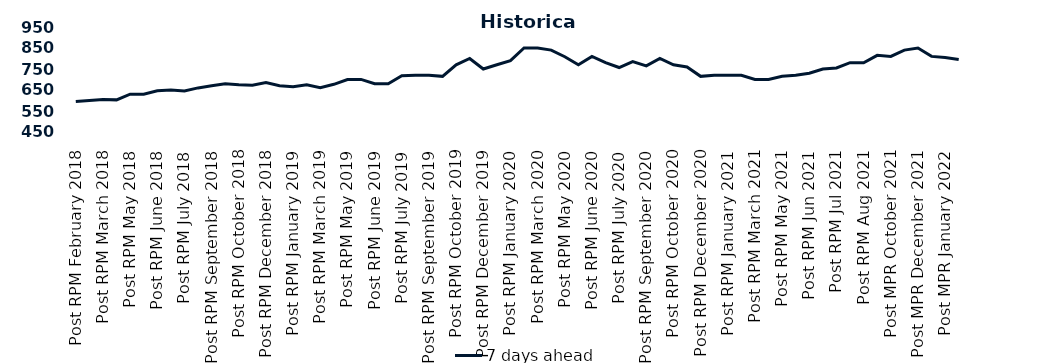
| Category | 7 days ahead |
|---|---|
| Post RPM February 2018 | 595 |
| Pre RPM March 2018 | 600 |
| Post RPM March 2018 | 605 |
| Pre RPM May 2018 | 603 |
| Post RPM May 2018 | 630 |
| Pre RPM June 2018 | 630 |
| Post RPM June 2018 | 646.5 |
| Pre RPM July 2018 | 650 |
| Post RPM July 2018 | 645 |
| Pre RPM September 2018 | 660 |
| Post RPM September 2018 | 670 |
| Pre RPM October 2018 | 680 |
| Post RPM October 2018 | 675 |
| Pre RPM December 2018 | 672.5 |
| Post RPM December 2018 | 685 |
| Pre RPM January 2019 | 670 |
| Post RPM January 2019 | 665 |
| Pre RPM March 2019 | 675 |
| Post RPM March 2019 | 661 |
| Pre RPM May 2019 | 677 |
| Post RPM May 2019 | 700 |
| Pre RPM June 2019 | 700.5 |
| Post RPM June 2019 | 680 |
| Pre RPM July 2019 | 680 |
| Post RPM July 2019 | 717.5 |
| Pre RPM September 2019 | 720 |
| Post RPM September 2019 | 720 |
| Pre RPM October 2019 | 715 |
| Post RPM October 2019 | 770 |
| Pre RPM December 2019 | 800 |
| Post RPM December 2019 | 750 |
| Pre RPM January 2020 | 770 |
| Post RPM January 2020 | 790 |
| Pre RPM March 2020 | 850 |
| Post RPM March 2020 | 850 |
| Pre RPM May 2020 | 840 |
| Post RPM May 2020 | 808.5 |
| Pre RPM June 2020 | 770 |
| Post RPM June 2020 | 810 |
| Pre RPM July 2020 | 780 |
| Post RPM July 2020 | 757 |
| Pre RPM September 2020 | 785 |
| Post RPM September 2020 | 765 |
| Pre RPM October 2020 | 800 |
| Post RPM October 2020 | 770 |
| Pre RPM December 2020 | 760 |
|  Post RPM December 2020 | 715 |
| Pre RPM January 2021 | 720 |
| Post RPM January 2021 | 720 |
|  Pre RPM March 2021 | 720 |
|  Post RPM March 2021 | 700 |
|  Pre RPM May 2021 | 700 |
|  Post RPM May 2021 | 715 |
|  Pre RPM Jun 2021 | 720 |
|   Post RPM Jun 2021 | 730 |
| Pre RPM Jul 2021 | 750 |
|  Post RPM Jul 2021 | 755 |
| Pre RPM Aug 2021 | 780 |
|  Post RPM Aug 2021 | 780 |
| Pre MPR October 2021 | 815 |
| Post MPR October 2021 | 810 |
| Pre MPR December 2021 | 840 |
| Post MPR December 2021 | 850 |
| Pre MPR January 2022 | 810 |
| Post MPR January 2022 | 805 |
| Pre MPR March 2022 | 795 |